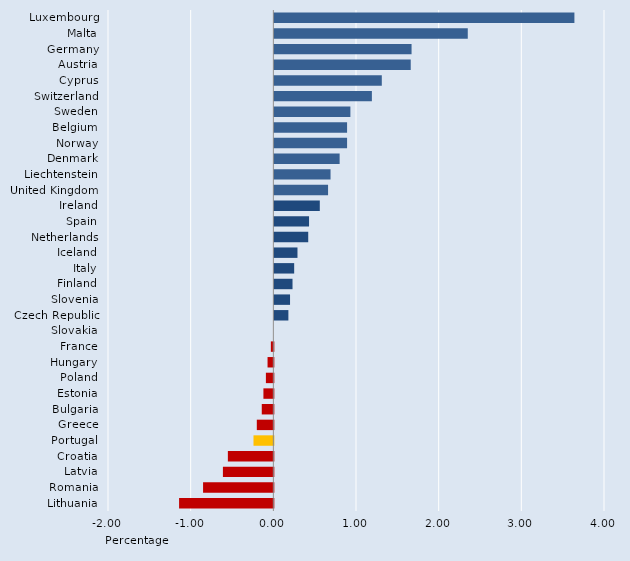
| Category | Series 0 |
|---|---|
| Luxembourg | 3.63 |
| Malta | 2.34 |
| Germany | 1.66 |
| Austria | 1.65 |
| Cyprus | 1.3 |
| Switzerland | 1.18 |
| Sweden | 0.92 |
| Belgium | 0.88 |
| Norway | 0.88 |
| Denmark | 0.79 |
| Liechtenstein | 0.68 |
| United Kingdom | 0.65 |
| Ireland | 0.55 |
| Spain | 0.42 |
| Netherlands | 0.41 |
| Iceland | 0.28 |
| Italy | 0.24 |
| Finland | 0.22 |
| Slovenia | 0.19 |
| Czech Republic | 0.17 |
| Slovakia | 0 |
| France | -0.03 |
| Hungary | -0.07 |
| Poland | -0.09 |
| Estonia | -0.12 |
| Bulgaria | -0.14 |
| Greece | -0.2 |
| Portugal | -0.24 |
| Croatia | -0.55 |
| Latvia | -0.61 |
| Romania | -0.85 |
| Lithuania | -1.14 |